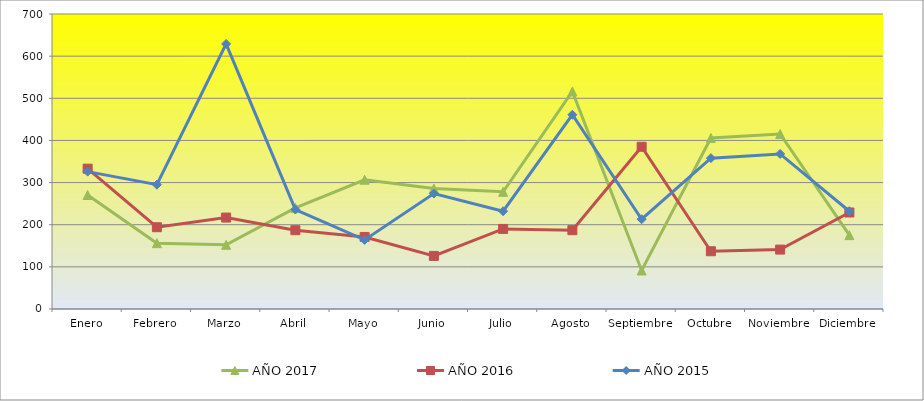
| Category | AÑO 2017 | AÑO 2016 | AÑO 2015 |
|---|---|---|---|
| Enero | 270.476 | 333 | 326 |
| Febrero | 156.19 | 194 | 295 |
| Marzo | 152.381 | 217 | 629 |
| Abril | 240 | 187 | 236 |
| Mayo | 306.667 | 171 | 164 |
| Junio | 285.714 | 126 | 274 |
| Julio | 278.095 | 190 | 232 |
| Agosto | 516.19 | 187 | 461 |
| Septiembre | 91.429 | 385 | 213 |
| Octubre | 405.714 | 137 | 358 |
| Noviembre | 415.238 | 141 | 368 |
| Diciembre | 175.238 | 229 | 232 |